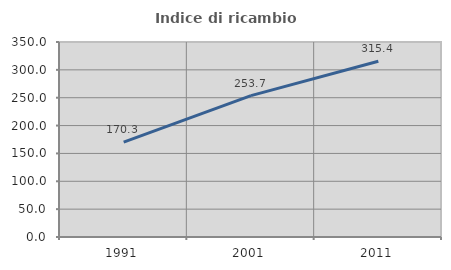
| Category | Indice di ricambio occupazionale  |
|---|---|
| 1991.0 | 170.253 |
| 2001.0 | 253.68 |
| 2011.0 | 315.385 |